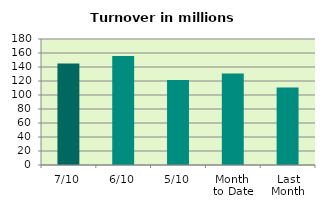
| Category | Series 0 |
|---|---|
| 7/10 | 145.042 |
| 6/10 | 155.851 |
| 5/10 | 121.376 |
| Month 
to Date | 130.69 |
| Last
Month | 110.611 |